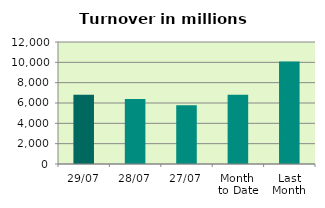
| Category | Series 0 |
|---|---|
| 29/07 | 6806.864 |
| 28/07 | 6402.503 |
| 27/07 | 5790.298 |
| Month 
to Date | 6821.061 |
| Last
Month | 10085.686 |